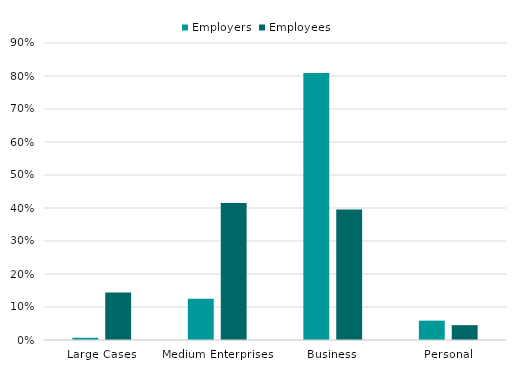
| Category | Employers | Employees |
|---|---|---|
| Large Cases | 0.007 | 0.144 |
| Medium Enterprises | 0.125 | 0.415 |
| Business | 0.809 | 0.396 |
| Personal | 0.059 | 0.045 |